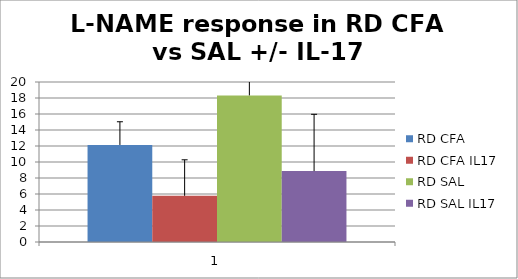
| Category | RD CFA | RD CFA IL17 | RD SAL | RD SAL IL17 |
|---|---|---|---|---|
| 0 | 12.13 | 5.775 | 18.327 | 8.863 |